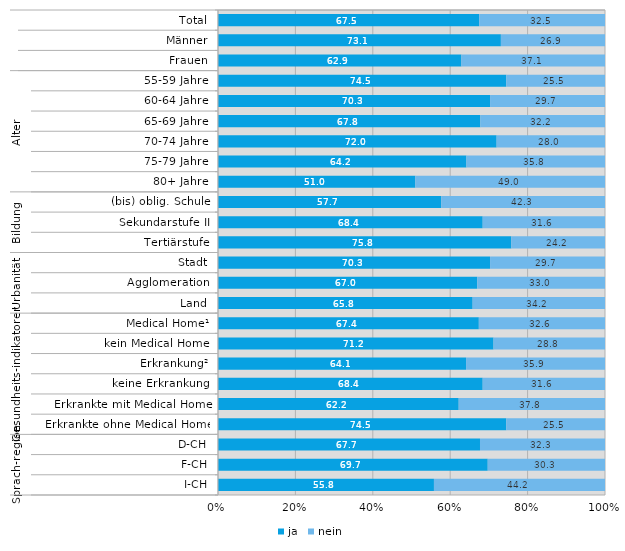
| Category | ja | nein |
|---|---|---|
| 0 | 67.5 | 32.5 |
| 1 | 73.1 | 26.9 |
| 2 | 62.9 | 37.1 |
| 3 | 74.5 | 25.5 |
| 4 | 70.3 | 29.7 |
| 5 | 67.8 | 32.2 |
| 6 | 72 | 28 |
| 7 | 64.2 | 35.8 |
| 8 | 51 | 49 |
| 9 | 57.7 | 42.3 |
| 10 | 68.4 | 31.6 |
| 11 | 75.8 | 24.2 |
| 12 | 70.3 | 29.7 |
| 13 | 67 | 33 |
| 14 | 65.8 | 34.2 |
| 15 | 67.4 | 32.6 |
| 16 | 71.2 | 28.8 |
| 17 | 64.1 | 35.9 |
| 18 | 68.4 | 31.6 |
| 19 | 62.2 | 37.8 |
| 20 | 74.5 | 25.5 |
| 21 | 67.7 | 32.3 |
| 22 | 69.7 | 30.3 |
| 23 | 55.8 | 44.2 |